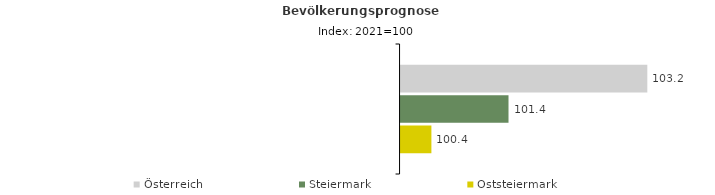
| Category | Österreich | Steiermark | Oststeiermark |
|---|---|---|---|
| 2021.0 | 103.2 | 101.4 | 100.4 |